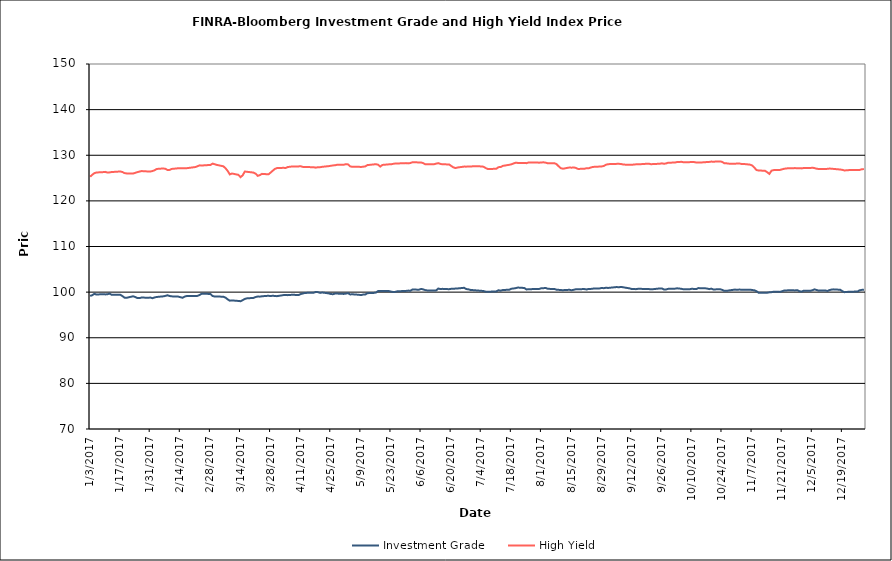
| Category | Investment Grade | High Yield |
|---|---|---|
| 1/3/17 | 99.167 | 125.29 |
| 1/4/17 | 99.324 | 125.718 |
| 1/5/17 | 99.629 | 126.08 |
| 1/6/17 | 99.465 | 126.222 |
| 1/9/17 | 99.562 | 126.301 |
| 1/10/17 | 99.502 | 126.358 |
| 1/11/17 | 99.52 | 126.215 |
| 1/12/17 | 99.682 | 126.236 |
| 1/13/17 | 99.426 | 126.315 |
| 1/17/17 | 99.431 | 126.442 |
| 1/18/17 | 99.159 | 126.34 |
| 1/19/17 | 98.789 | 126.091 |
| 1/20/17 | 98.753 | 126.016 |
| 1/23/17 | 99.094 | 125.997 |
| 1/24/17 | 98.935 | 126.138 |
| 1/25/17 | 98.694 | 126.299 |
| 1/26/17 | 98.686 | 126.427 |
| 1/27/17 | 98.832 | 126.533 |
| 1/30/17 | 98.744 | 126.442 |
| 1/31/17 | 98.822 | 126.428 |
| 2/1/17 | 98.666 | 126.54 |
| 2/2/17 | 98.834 | 126.71 |
| 2/3/17 | 98.938 | 126.997 |
| 2/6/17 | 99.073 | 127.105 |
| 2/7/17 | 99.167 | 127.032 |
| 2/8/17 | 99.313 | 126.779 |
| 2/9/17 | 99.148 | 126.792 |
| 2/10/17 | 99.072 | 127.001 |
| 2/13/17 | 99.019 | 127.148 |
| 2/14/17 | 98.891 | 127.17 |
| 2/15/17 | 98.774 | 127.135 |
| 2/16/17 | 99.017 | 127.143 |
| 2/17/17 | 99.152 | 127.164 |
| 2/21/17 | 99.158 | 127.417 |
| 2/22/17 | 99.179 | 127.596 |
| 2/23/17 | 99.392 | 127.788 |
| 2/24/17 | 99.66 | 127.755 |
| 2/27/17 | 99.612 | 127.849 |
| 2/28/17 | 99.611 | 127.865 |
| 3/1/17 | 99.147 | 128.167 |
| 3/2/17 | 99.036 | 128.03 |
| 3/3/17 | 99.029 | 127.88 |
| 3/6/17 | 98.999 | 127.582 |
| 3/7/17 | 98.792 | 127.155 |
| 3/8/17 | 98.418 | 126.57 |
| 3/9/17 | 98.122 | 125.801 |
| 3/10/17 | 98.185 | 125.997 |
| 3/13/17 | 98.066 | 125.711 |
| 3/14/17 | 98.01 | 125.195 |
| 3/15/17 | 98.242 | 125.611 |
| 3/16/17 | 98.512 | 126.437 |
| 3/17/17 | 98.636 | 126.374 |
| 3/20/17 | 98.731 | 126.207 |
| 3/21/17 | 98.926 | 125.972 |
| 3/22/17 | 99.036 | 125.486 |
| 3/23/17 | 99.008 | 125.659 |
| 3/24/17 | 99.092 | 125.92 |
| 3/27/17 | 99.203 | 125.816 |
| 3/28/17 | 99.135 | 126.205 |
| 3/29/17 | 99.22 | 126.619 |
| 3/30/17 | 99.134 | 127.017 |
| 3/31/17 | 99.12 | 127.191 |
| 4/3/17 | 99.352 | 127.242 |
| 4/4/17 | 99.346 | 127.214 |
| 4/5/17 | 99.341 | 127.433 |
| 4/6/17 | 99.373 | 127.467 |
| 4/7/17 | 99.424 | 127.55 |
| 4/10/17 | 99.36 | 127.557 |
| 4/11/17 | 99.58 | 127.584 |
| 4/12/17 | 99.7 | 127.45 |
| 4/13/17 | 99.828 | 127.43 |
| 4/17/17 | 99.864 | 127.372 |
| 4/18/17 | 100.048 | 127.28 |
| 4/19/17 | 99.994 | 127.383 |
| 4/20/17 | 99.833 | 127.38 |
| 4/21/17 | 99.919 | 127.467 |
| 4/24/17 | 99.724 | 127.614 |
| 4/25/17 | 99.581 | 127.691 |
| 4/26/17 | 99.546 | 127.769 |
| 4/27/17 | 99.683 | 127.81 |
| 4/28/17 | 99.68 | 127.918 |
| 5/1/17 | 99.61 | 127.928 |
| 5/2/17 | 99.679 | 128.036 |
| 5/3/17 | 99.773 | 127.994 |
| 5/4/17 | 99.494 | 127.57 |
| 5/5/17 | 99.528 | 127.458 |
| 5/8/17 | 99.422 | 127.476 |
| 5/9/17 | 99.348 | 127.426 |
| 5/10/17 | 99.464 | 127.493 |
| 5/11/17 | 99.465 | 127.549 |
| 5/12/17 | 99.771 | 127.84 |
| 5/15/17 | 99.83 | 127.994 |
| 5/16/17 | 99.908 | 128.044 |
| 5/17/17 | 100.232 | 127.918 |
| 5/18/17 | 100.236 | 127.513 |
| 5/19/17 | 100.22 | 127.878 |
| 5/22/17 | 100.234 | 128.008 |
| 5/23/17 | 100.12 | 128.02 |
| 5/24/17 | 100.026 | 128.117 |
| 5/25/17 | 100.058 | 128.192 |
| 5/26/17 | 100.179 | 128.198 |
| 5/30/17 | 100.268 | 128.276 |
| 5/31/17 | 100.336 | 128.216 |
| 6/1/17 | 100.29 | 128.298 |
| 6/2/17 | 100.573 | 128.473 |
| 6/5/17 | 100.532 | 128.426 |
| 6/6/17 | 100.701 | 128.409 |
| 6/7/17 | 100.598 | 128.271 |
| 6/8/17 | 100.441 | 128.001 |
| 6/9/17 | 100.364 | 128.01 |
| 6/12/17 | 100.371 | 128.036 |
| 6/13/17 | 100.379 | 128.163 |
| 6/14/17 | 100.791 | 128.27 |
| 6/15/17 | 100.673 | 128.1 |
| 6/16/17 | 100.717 | 128.006 |
| 6/19/17 | 100.641 | 127.995 |
| 6/20/17 | 100.724 | 127.654 |
| 6/21/17 | 100.732 | 127.349 |
| 6/22/17 | 100.78 | 127.197 |
| 6/23/17 | 100.807 | 127.322 |
| 6/26/17 | 100.948 | 127.512 |
| 6/27/17 | 100.676 | 127.503 |
| 6/28/17 | 100.616 | 127.544 |
| 6/29/17 | 100.472 | 127.522 |
| 6/30/17 | 100.444 | 127.575 |
| 7/3/17 | 100.327 | 127.582 |
| 7/5/17 | 100.249 | 127.495 |
| 7/6/17 | 100.103 | 127.207 |
| 7/7/17 | 100.053 | 126.98 |
| 7/10/17 | 100.159 | 127.021 |
| 7/11/17 | 100.16 | 127.037 |
| 7/12/17 | 100.413 | 127.393 |
| 7/13/17 | 100.316 | 127.41 |
| 7/14/17 | 100.475 | 127.671 |
| 7/17/17 | 100.512 | 127.906 |
| 7/18/17 | 100.747 | 128.014 |
| 7/19/17 | 100.793 | 128.2 |
| 7/20/17 | 100.882 | 128.363 |
| 7/21/17 | 101.003 | 128.319 |
| 7/24/17 | 100.907 | 128.32 |
| 7/25/17 | 100.593 | 128.264 |
| 7/26/17 | 100.617 | 128.423 |
| 7/27/17 | 100.612 | 128.402 |
| 7/28/17 | 100.698 | 128.427 |
| 7/31/17 | 100.712 | 128.375 |
| 8/1/17 | 100.858 | 128.429 |
| 8/2/17 | 100.869 | 128.446 |
| 8/3/17 | 100.91 | 128.372 |
| 8/4/17 | 100.719 | 128.226 |
| 8/7/17 | 100.69 | 128.247 |
| 8/8/17 | 100.529 | 128.057 |
| 8/9/17 | 100.501 | 127.577 |
| 8/10/17 | 100.444 | 127.161 |
| 8/11/17 | 100.428 | 127.045 |
| 8/14/17 | 100.51 | 127.316 |
| 8/15/17 | 100.408 | 127.277 |
| 8/16/17 | 100.511 | 127.325 |
| 8/17/17 | 100.625 | 127.225 |
| 8/18/17 | 100.649 | 126.998 |
| 8/21/17 | 100.662 | 127.05 |
| 8/22/17 | 100.58 | 127.155 |
| 8/23/17 | 100.707 | 127.154 |
| 8/24/17 | 100.702 | 127.322 |
| 8/25/17 | 100.766 | 127.444 |
| 8/28/17 | 100.811 | 127.519 |
| 8/29/17 | 100.91 | 127.551 |
| 8/30/17 | 100.866 | 127.652 |
| 8/31/17 | 100.955 | 127.923 |
| 9/1/17 | 100.918 | 128.046 |
| 9/5/17 | 101.116 | 128.11 |
| 9/6/17 | 101.064 | 128.114 |
| 9/7/17 | 101.148 | 128.098 |
| 9/8/17 | 101.061 | 127.96 |
| 9/11/17 | 100.823 | 127.908 |
| 9/12/17 | 100.676 | 127.893 |
| 9/13/17 | 100.664 | 127.977 |
| 9/14/17 | 100.655 | 128.006 |
| 9/15/17 | 100.738 | 128.012 |
| 9/18/17 | 100.691 | 128.097 |
| 9/19/17 | 100.71 | 128.152 |
| 9/20/17 | 100.669 | 128.143 |
| 9/21/17 | 100.604 | 128.023 |
| 9/22/17 | 100.65 | 128.083 |
| 9/25/17 | 100.805 | 128.129 |
| 9/26/17 | 100.807 | 128.234 |
| 9/27/17 | 100.562 | 128.132 |
| 9/28/17 | 100.593 | 128.209 |
| 9/29/17 | 100.721 | 128.376 |
| 10/2/17 | 100.746 | 128.389 |
| 10/3/17 | 100.834 | 128.512 |
| 10/4/17 | 100.794 | 128.503 |
| 10/5/17 | 100.73 | 128.568 |
| 10/6/17 | 100.629 | 128.471 |
| 10/9/17 | 100.645 | 128.493 |
| 10/10/17 | 100.736 | 128.533 |
| 10/11/17 | 100.693 | 128.507 |
| 10/12/17 | 100.668 | 128.408 |
| 10/13/17 | 100.881 | 128.399 |
| 10/16/17 | 100.84 | 128.461 |
| 10/17/17 | 100.795 | 128.526 |
| 10/18/17 | 100.661 | 128.534 |
| 10/19/17 | 100.761 | 128.61 |
| 10/20/17 | 100.579 | 128.587 |
| 10/23/17 | 100.646 | 128.657 |
| 10/24/17 | 100.499 | 128.553 |
| 10/25/17 | 100.282 | 128.267 |
| 10/26/17 | 100.274 | 128.238 |
| 10/27/17 | 100.354 | 128.165 |
| 10/30/17 | 100.557 | 128.146 |
| 10/31/17 | 100.509 | 128.181 |
| 11/1/17 | 100.558 | 128.202 |
| 11/2/17 | 100.534 | 128.091 |
| 11/3/17 | 100.544 | 128.096 |
| 11/6/17 | 100.546 | 127.944 |
| 11/7/17 | 100.462 | 127.761 |
| 11/8/17 | 100.402 | 127.309 |
| 11/9/17 | 100.215 | 126.763 |
| 11/10/17 | 99.868 | 126.665 |
| 11/13/17 | 99.862 | 126.59 |
| 11/14/17 | 99.872 | 126.281 |
| 11/15/17 | 99.956 | 125.912 |
| 11/16/17 | 99.994 | 126.616 |
| 11/17/17 | 100.092 | 126.74 |
| 11/20/17 | 100.053 | 126.791 |
| 11/21/17 | 100.208 | 126.93 |
| 11/22/17 | 100.355 | 127.049 |
| 11/24/17 | 100.398 | 127.165 |
| 11/27/17 | 100.38 | 127.179 |
| 11/28/17 | 100.434 | 127.171 |
| 11/29/17 | 100.207 | 127.16 |
| 11/30/17 | 100.115 | 127.119 |
| 12/1/17 | 100.319 | 127.199 |
| 12/4/17 | 100.297 | 127.193 |
| 12/5/17 | 100.413 | 127.273 |
| 12/6/17 | 100.604 | 127.188 |
| 12/7/17 | 100.463 | 127.047 |
| 12/8/17 | 100.326 | 126.989 |
| 12/11/17 | 100.36 | 126.978 |
| 12/12/17 | 100.255 | 127.021 |
| 12/13/17 | 100.446 | 127.08 |
| 12/14/17 | 100.569 | 127.054 |
| 12/15/17 | 100.606 | 127 |
| 12/18/17 | 100.509 | 126.871 |
| 12/19/17 | 100.19 | 126.797 |
| 12/20/17 | 99.99 | 126.652 |
| 12/21/17 | 100.044 | 126.725 |
| 12/22/17 | 100.072 | 126.741 |
| 12/26/17 | 100.134 | 126.789 |
| 12/27/17 | 100.395 | 126.782 |
| 12/28/17 | 100.493 | 126.924 |
| 12/29/17 | 100.537 | 126.974 |